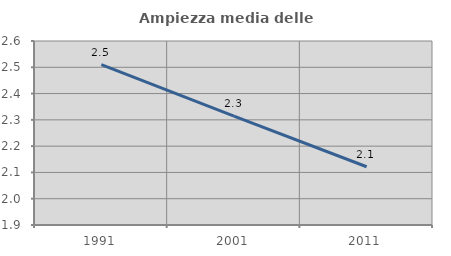
| Category | Ampiezza media delle famiglie |
|---|---|
| 1991.0 | 2.51 |
| 2001.0 | 2.314 |
| 2011.0 | 2.122 |